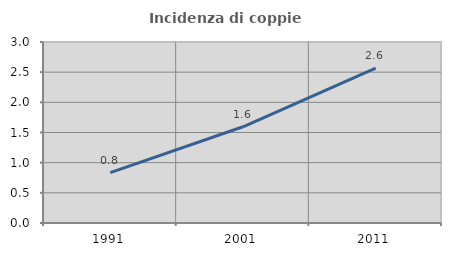
| Category | Incidenza di coppie miste |
|---|---|
| 1991.0 | 0.834 |
| 2001.0 | 1.595 |
| 2011.0 | 2.567 |